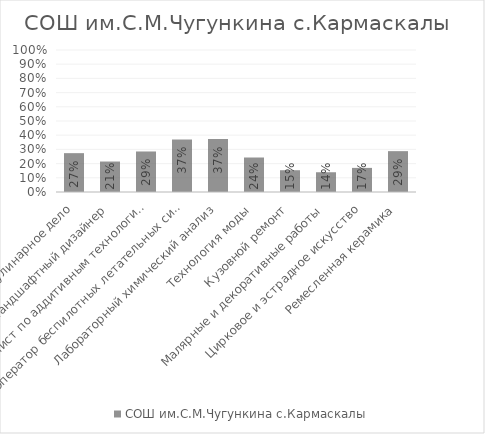
| Category | СОШ им.С.М.Чугункина с.Кармаскалы |
|---|---|
| Кулинарное дело | 0.274 |
| Ландшафтный дизайнер | 0.215 |
| Специалист по аддитивным технологиям | 0.285 |
| Оператор беспилотных летательных систем | 0.37 |
| Лабораторный химический анализ | 0.373 |
| Технология моды | 0.243 |
| Кузовной ремонт | 0.153 |
| Малярные и декоративные работы | 0.139 |
| Цирковое и эстрадное искусство | 0.17 |
| Ремесленная керамика | 0.288 |